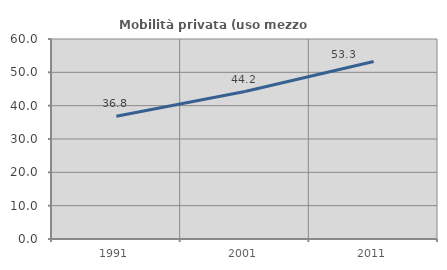
| Category | Mobilità privata (uso mezzo privato) |
|---|---|
| 1991.0 | 36.842 |
| 2001.0 | 44.248 |
| 2011.0 | 53.261 |